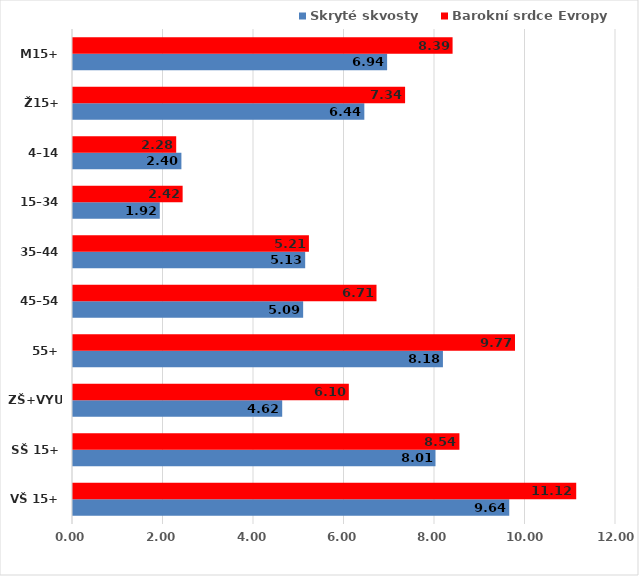
| Category | Skryté skvosty | Barokní srdce Evropy |
|---|---|---|
| VŠ 15+ | 9.641 | 11.121 |
| SŠ 15+ | 8.011 | 8.54 |
| ZŠ+VYUČ | 4.623 | 6.096 |
| 55+ | 8.175 | 9.768 |
| 45–54 | 5.086 | 6.707 |
| 35–44 | 5.131 | 5.214 |
| 15–34 | 1.918 | 2.423 |
| 4–14 | 2.396 | 2.281 |
| Ž15+ | 6.438 | 7.339 |
| M15+ | 6.942 | 8.389 |